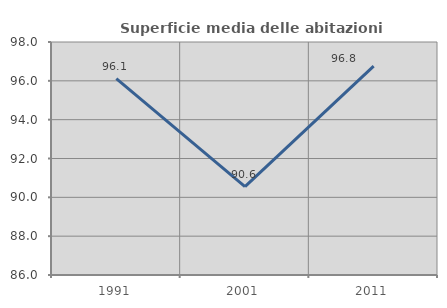
| Category | Superficie media delle abitazioni occupate |
|---|---|
| 1991.0 | 96.11 |
| 2001.0 | 90.556 |
| 2011.0 | 96.76 |